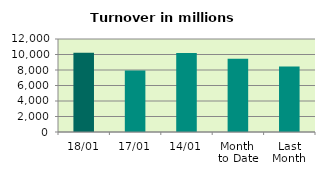
| Category | Series 0 |
|---|---|
| 18/01 | 10211.804 |
| 17/01 | 7922.919 |
| 14/01 | 10207.573 |
| Month 
to Date | 9464.869 |
| Last
Month | 8461.957 |